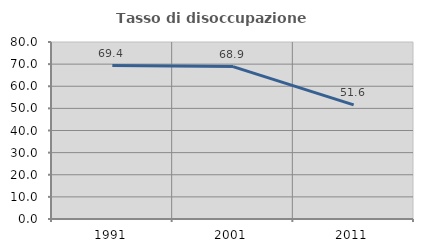
| Category | Tasso di disoccupazione giovanile  |
|---|---|
| 1991.0 | 69.363 |
| 2001.0 | 68.878 |
| 2011.0 | 51.583 |